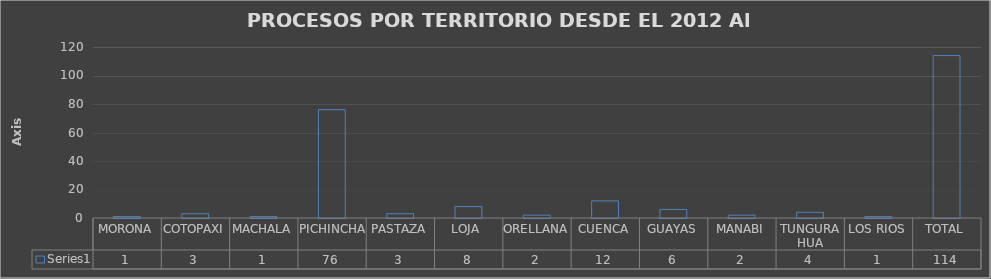
| Category | Series 0 |
|---|---|
| MORONA | 1 |
| COTOPAXI | 3 |
| MACHALA | 1 |
| PICHINCHA  | 76 |
| PASTAZA | 3 |
| LOJA  | 8 |
| ORELLANA | 2 |
| CUENCA | 12 |
| GUAYAS | 6 |
| MANABI | 2 |
| TUNGURAHUA | 4 |
| LOS RIOS | 1 |
| TOTAL | 114 |